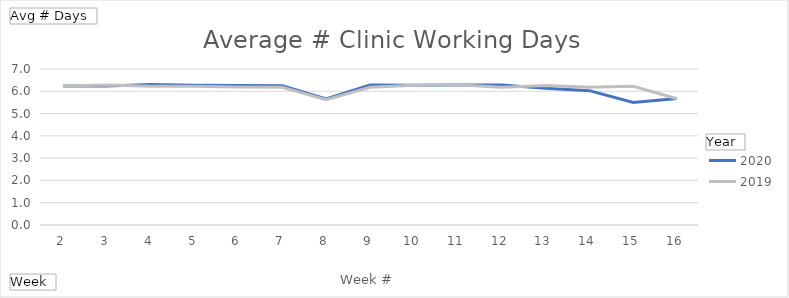
| Category | 2020 | 2019 |
|---|---|---|
| 2 | 6.241 | 6.241 |
| 3 | 6.241 | 6.278 |
| 4 | 6.306 | 6.231 |
| 5 | 6.269 | 6.222 |
| 6 | 6.259 | 6.194 |
| 7 | 6.25 | 6.176 |
| 8 | 5.657 | 5.62 |
| 9 | 6.287 | 6.176 |
| 10 | 6.269 | 6.269 |
| 11 | 6.278 | 6.296 |
| 12 | 6.278 | 6.185 |
| 13 | 6.139 | 6.259 |
| 14 | 6.028 | 6.185 |
| 15 | 5.495 | 6.222 |
| 16 | 5.676 | 5.667 |